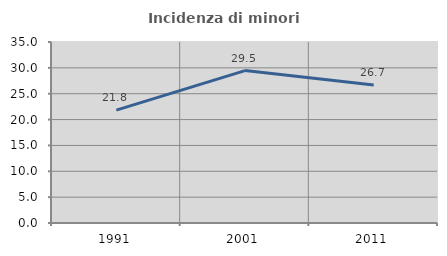
| Category | Incidenza di minori stranieri |
|---|---|
| 1991.0 | 21.818 |
| 2001.0 | 29.478 |
| 2011.0 | 26.673 |